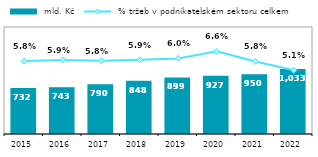
| Category |  mld. Kč |
|---|---|
| 2015.0 | 731.591 |
| 2016.0 | 742.844 |
| 2017.0 | 789.99 |
| 2018.0 | 847.611 |
| 2019.0 | 899.422 |
| 2020.0 | 926.669 |
| 2021.0 | 950.226 |
| 2022.0 | 1033.182 |